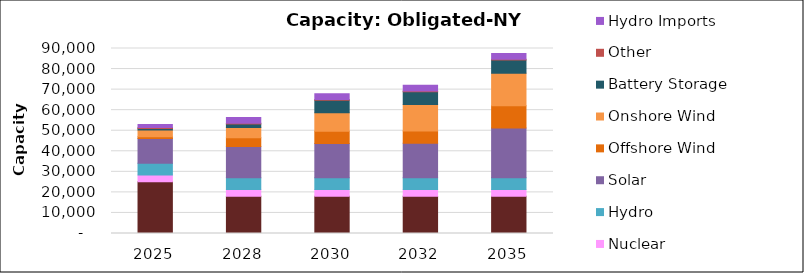
| Category | Gas & FO | Zero-Carbon Firm Resources | Nuclear | Hydro | Solar | Offshore Wind | Onshore Wind | Battery Storage | Other | Hydro Imports |
|---|---|---|---|---|---|---|---|---|---|---|
| 2025.0 | 25145.8 | 0 | 3333.6 | 5704.75 | 11986.19 | 924 | 3297.24 | 676.5 | 475.95 | 1485 |
| 2028.0 | 18129.4 | 0 | 3333.6 | 5704.75 | 15128.35 | 4300 | 4966.44 | 1711.5 | 369.65 | 2735 |
| 2030.0 | 18129.4 | 0 | 3333.6 | 5704.75 | 16564.35 | 6000 | 8966.44 | 6150 | 369.65 | 2735 |
| 2032.0 | 18129.4 | 0 | 3333.6 | 5704.75 | 16682.42 | 6000 | 12966.44 | 6150 | 369.65 | 2735 |
| 2035.0 | 18129.4 | 0 | 3333.6 | 5704.75 | 24182.42 | 10855.52 | 15808.44 | 6406.72 | 369.65 | 2735 |